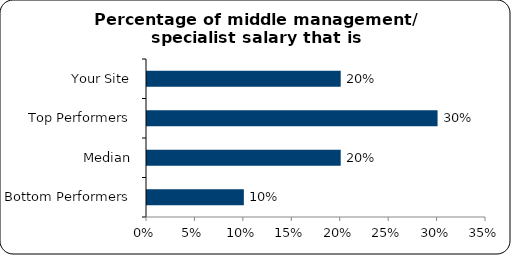
| Category | Percentage of middle management/ specialist salary that is performance-related pay |
|---|---|
| Bottom Performers | 10 |
| Median | 20 |
| Top Performers | 30 |
| Your Site | 20 |